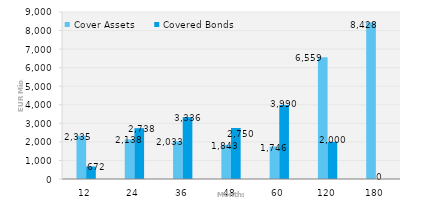
| Category | Cover Assets | Covered Bonds |
|---|---|---|
| 12.0 | 2335.054 | 671.844 |
| 24.0 | 2137.958 | 2738 |
| 36.0 | 2033.422 | 3336.41 |
| 48.0 | 1842.741 | 2750 |
| 60.0 | 1746.488 | 3990 |
| 120.0 | 6558.949 | 2000 |
| 180.0 | 8428.31 | 0 |